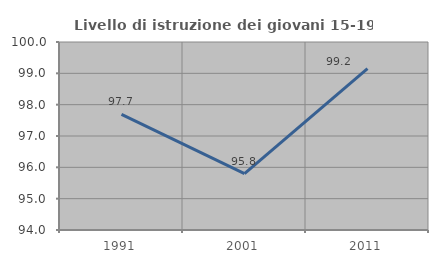
| Category | Livello di istruzione dei giovani 15-19 anni |
|---|---|
| 1991.0 | 97.691 |
| 2001.0 | 95.798 |
| 2011.0 | 99.151 |